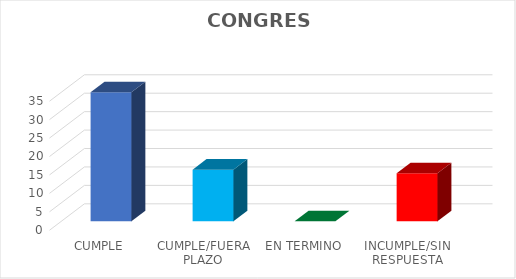
| Category | TOTAL |
|---|---|
| CUMPLE | 35 |
| CUMPLE/FUERA PLAZO | 14 |
| EN TERMINO | 0 |
| INCUMPLE/SIN RESPUESTA | 13 |